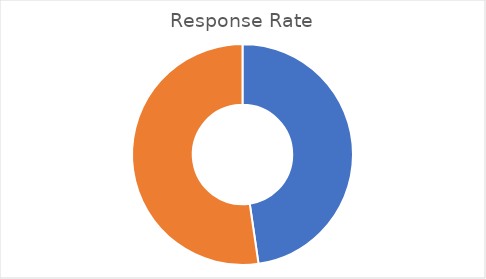
| Category | Total |
|---|---|
| Sum of OverallRespRate | 47.684 |
| Sum of OverallNonRespRate | 52.316 |